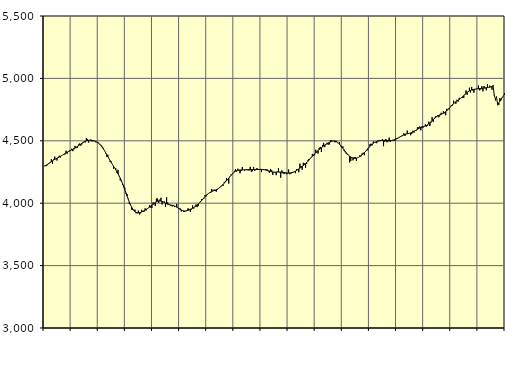
| Category | Piggar | Series 1 |
|---|---|---|
| nan | 4300.8 | 4297.25 |
| 87.0 | 4297.1 | 4302.27 |
| 87.0 | 4300.6 | 4307.8 |
| 87.0 | 4313.3 | 4314.05 |
| 87.0 | 4322.1 | 4320.34 |
| 87.0 | 4322.4 | 4326.75 |
| 87.0 | 4352.9 | 4333.14 |
| 87.0 | 4314.6 | 4339.4 |
| 87.0 | 4351.1 | 4345.41 |
| 87.0 | 4373.7 | 4350.91 |
| 87.0 | 4353.4 | 4356.05 |
| 87.0 | 4342.1 | 4360.87 |
| nan | 4368.8 | 4365.53 |
| 88.0 | 4380.7 | 4370.19 |
| 88.0 | 4366.9 | 4375.08 |
| 88.0 | 4380.6 | 4380.28 |
| 88.0 | 4385.6 | 4385.65 |
| 88.0 | 4387.2 | 4391.14 |
| 88.0 | 4390.4 | 4396.7 |
| 88.0 | 4421.1 | 4402.19 |
| 88.0 | 4396.6 | 4407.5 |
| 88.0 | 4416.2 | 4412.53 |
| 88.0 | 4421.5 | 4417.41 |
| 88.0 | 4418.7 | 4422.3 |
| nan | 4436.6 | 4427.24 |
| 89.0 | 4416.9 | 4432.22 |
| 89.0 | 4431.6 | 4437.27 |
| 89.0 | 4459.4 | 4442.49 |
| 89.0 | 4441.5 | 4448.03 |
| 89.0 | 4443.5 | 4453.99 |
| 89.0 | 4469.9 | 4460.3 |
| 89.0 | 4478 | 4466.82 |
| 89.0 | 4460.4 | 4473.35 |
| 89.0 | 4471.1 | 4479.75 |
| 89.0 | 4489.3 | 4485.74 |
| 89.0 | 4492.8 | 4491.15 |
| nan | 4486.7 | 4495.78 |
| 90.0 | 4520.4 | 4499.45 |
| 90.0 | 4512.7 | 4502.15 |
| 90.0 | 4485.9 | 4503.76 |
| 90.0 | 4504 | 4504.3 |
| 90.0 | 4510.4 | 4503.93 |
| 90.0 | 4494.1 | 4502.73 |
| 90.0 | 4503.8 | 4500.8 |
| 90.0 | 4500 | 4498.34 |
| 90.0 | 4488.6 | 4495.27 |
| 90.0 | 4489.1 | 4491.31 |
| 90.0 | 4489.9 | 4486.16 |
| nan | 4483.9 | 4479.54 |
| 91.0 | 4467.4 | 4471.19 |
| 91.0 | 4466.7 | 4461.06 |
| 91.0 | 4453.4 | 4449.3 |
| 91.0 | 4443.2 | 4436.01 |
| 91.0 | 4422.9 | 4421.37 |
| 91.0 | 4399.8 | 4405.61 |
| 91.0 | 4372 | 4389.22 |
| 91.0 | 4388.2 | 4372.75 |
| 91.0 | 4355.3 | 4356.65 |
| 91.0 | 4331.2 | 4341.21 |
| 91.0 | 4334.3 | 4326.37 |
| nan | 4311.2 | 4311.9 |
| 92.0 | 4277.2 | 4297.64 |
| 92.0 | 4283.8 | 4283.23 |
| 92.0 | 4279.1 | 4268.33 |
| 92.0 | 4242.7 | 4252.77 |
| 92.0 | 4267.4 | 4236.26 |
| 92.0 | 4216.8 | 4218.68 |
| 92.0 | 4181.9 | 4199.83 |
| 92.0 | 4182.8 | 4179.46 |
| 92.0 | 4145.9 | 4157.32 |
| 92.0 | 4144.5 | 4133.66 |
| 92.0 | 4125.7 | 4108.84 |
| nan | 4075.8 | 4083.28 |
| 93.0 | 4073.5 | 4057.77 |
| 93.0 | 4036.7 | 4033.08 |
| 93.0 | 3992.5 | 4009.7 |
| 93.0 | 3993.3 | 3988.27 |
| 93.0 | 3949.2 | 3969.46 |
| 93.0 | 3945.2 | 3953.64 |
| 93.0 | 3939 | 3941.31 |
| 93.0 | 3948.5 | 3932.5 |
| 93.0 | 3919.5 | 3926.88 |
| 93.0 | 3918.8 | 3923.94 |
| 93.0 | 3940.3 | 3923.19 |
| nan | 3910 | 3924.29 |
| 94.0 | 3918.1 | 3926.77 |
| 94.0 | 3946.7 | 3930.23 |
| 94.0 | 3933.3 | 3934.61 |
| 94.0 | 3931.4 | 3939.59 |
| 94.0 | 3959.1 | 3944.83 |
| 94.0 | 3942.3 | 3950.41 |
| 94.0 | 3955.1 | 3956.24 |
| 94.0 | 3964.8 | 3962.23 |
| 94.0 | 3985.5 | 3968.63 |
| 94.0 | 3964.9 | 3975.6 |
| 94.0 | 3963.5 | 3983 |
| nan | 4005.3 | 3990.74 |
| 95.0 | 3992.2 | 3998.51 |
| 95.0 | 3977.4 | 4005.62 |
| 95.0 | 4036.5 | 4011.48 |
| 95.0 | 4037.4 | 4015.74 |
| 95.0 | 4002.2 | 4018.14 |
| 95.0 | 4028.7 | 4018.6 |
| 95.0 | 4043.5 | 4017.23 |
| 95.0 | 3990.4 | 4014.29 |
| 95.0 | 4011 | 4010.18 |
| 95.0 | 4013.8 | 4005.33 |
| 95.0 | 3970.9 | 4000.38 |
| nan | 4047.2 | 3995.82 |
| 96.0 | 4006.3 | 3991.89 |
| 96.0 | 3990.4 | 3988.86 |
| 96.0 | 3987.3 | 3986.54 |
| 96.0 | 3979.1 | 3984.52 |
| 96.0 | 3974.3 | 3982.53 |
| 96.0 | 3985.6 | 3980.21 |
| 96.0 | 3969 | 3977.11 |
| 96.0 | 3973.2 | 3973.03 |
| 96.0 | 3994.9 | 3968.09 |
| 96.0 | 3963.3 | 3962.54 |
| 96.0 | 3953.2 | 3956.82 |
| nan | 3958.4 | 3951.25 |
| 97.0 | 3933.9 | 3946.12 |
| 97.0 | 3939.4 | 3941.87 |
| 97.0 | 3929.7 | 3938.89 |
| 97.0 | 3930.2 | 3937.51 |
| 97.0 | 3936.7 | 3937.9 |
| 97.0 | 3941.8 | 3939.87 |
| 97.0 | 3959.7 | 3942.97 |
| 97.0 | 3953.6 | 3946.76 |
| 97.0 | 3930.8 | 3950.86 |
| 97.0 | 3949.8 | 3955.15 |
| 97.0 | 3982.3 | 3959.69 |
| nan | 3956.7 | 3964.65 |
| 98.0 | 3972 | 3970.25 |
| 98.0 | 3989.3 | 3976.73 |
| 98.0 | 3968.5 | 3984.18 |
| 98.0 | 3976.5 | 3992.64 |
| 98.0 | 4002.2 | 4001.89 |
| 98.0 | 4017.5 | 4011.69 |
| 98.0 | 4033.1 | 4021.78 |
| 98.0 | 4033.6 | 4032.01 |
| 98.0 | 4037 | 4042.33 |
| 98.0 | 4064.4 | 4052.48 |
| 98.0 | 4054.8 | 4061.99 |
| nan | 4067.3 | 4070.52 |
| 99.0 | 4080.3 | 4077.96 |
| 99.0 | 4084.8 | 4084.2 |
| 99.0 | 4081.8 | 4089.43 |
| 99.0 | 4113.6 | 4093.87 |
| 99.0 | 4100.1 | 4097.66 |
| 99.0 | 4109.2 | 4100.92 |
| 99.0 | 4098.3 | 4104.11 |
| 99.0 | 4092.4 | 4107.94 |
| 99.0 | 4109.2 | 4112.79 |
| 99.0 | 4117.4 | 4118.7 |
| 99.0 | 4122.7 | 4125.63 |
| nan | 4137.3 | 4133.51 |
| 0.0 | 4145.4 | 4142.1 |
| 0.0 | 4139.2 | 4151.14 |
| 0.0 | 4167.8 | 4160.56 |
| 0.0 | 4178.7 | 4170.23 |
| 0.0 | 4202.1 | 4180.11 |
| 0.0 | 4185.6 | 4190.44 |
| 0.0 | 4157.3 | 4201.21 |
| 0.0 | 4214.8 | 4212.13 |
| 0.0 | 4229.2 | 4222.83 |
| 0.0 | 4235 | 4232.91 |
| 0.0 | 4243.4 | 4242 |
| nan | 4259.8 | 4249.75 |
| 1.0 | 4273.2 | 4255.97 |
| 1.0 | 4253.6 | 4260.63 |
| 1.0 | 4276.1 | 4263.67 |
| 1.0 | 4261.1 | 4265.32 |
| 1.0 | 4239.9 | 4266.04 |
| 1.0 | 4258.1 | 4266.23 |
| 1.0 | 4289 | 4266.44 |
| 1.0 | 4266.6 | 4266.86 |
| 1.0 | 4260.5 | 4267.3 |
| 1.0 | 4269.2 | 4267.76 |
| 1.0 | 4273.4 | 4268.23 |
| nan | 4263.8 | 4268.6 |
| 2.0 | 4262.6 | 4268.92 |
| 2.0 | 4291.2 | 4269.18 |
| 2.0 | 4252.1 | 4269.44 |
| 2.0 | 4256.7 | 4269.67 |
| 2.0 | 4288.9 | 4269.94 |
| 2.0 | 4258.5 | 4270.19 |
| 2.0 | 4273.7 | 4270.29 |
| 2.0 | 4281.6 | 4270.3 |
| 2.0 | 4266.7 | 4270.25 |
| 2.0 | 4268.7 | 4270.03 |
| 2.0 | 4275.4 | 4269.74 |
| nan | 4249.4 | 4269.35 |
| 3.0 | 4273.3 | 4268.84 |
| 3.0 | 4271.5 | 4268.16 |
| 3.0 | 4266.8 | 4267.16 |
| 3.0 | 4273.6 | 4265.65 |
| 3.0 | 4270.5 | 4263.5 |
| 3.0 | 4254.7 | 4260.78 |
| 3.0 | 4243.9 | 4257.73 |
| 3.0 | 4274.2 | 4254.65 |
| 3.0 | 4264.2 | 4251.97 |
| 3.0 | 4227 | 4250.01 |
| 3.0 | 4249.5 | 4248.9 |
| nan | 4245.7 | 4248.63 |
| 4.0 | 4224.8 | 4248.87 |
| 4.0 | 4252.6 | 4249.28 |
| 4.0 | 4279.5 | 4249.66 |
| 4.0 | 4247.8 | 4249.77 |
| 4.0 | 4204.4 | 4249.42 |
| 4.0 | 4263.2 | 4248.62 |
| 4.0 | 4238.8 | 4247.49 |
| 4.0 | 4233.4 | 4246.02 |
| 4.0 | 4247.6 | 4244.3 |
| 4.0 | 4232 | 4242.84 |
| 4.0 | 4238.9 | 4241.83 |
| nan | 4269.8 | 4241.34 |
| 5.0 | 4232.4 | 4241.72 |
| 5.0 | 4236.9 | 4242.96 |
| 5.0 | 4248.1 | 4244.92 |
| 5.0 | 4249.8 | 4247.8 |
| 5.0 | 4255.4 | 4251.78 |
| 5.0 | 4240.4 | 4256.66 |
| 5.0 | 4272.6 | 4262.21 |
| 5.0 | 4271.7 | 4268.31 |
| 5.0 | 4248.3 | 4274.78 |
| 5.0 | 4317.1 | 4281.34 |
| 5.0 | 4298.3 | 4287.98 |
| nan | 4268.6 | 4294.75 |
| 6.0 | 4324 | 4301.66 |
| 6.0 | 4317.8 | 4309.03 |
| 6.0 | 4283.9 | 4317.1 |
| 6.0 | 4315.2 | 4325.9 |
| 6.0 | 4342.6 | 4335.33 |
| 6.0 | 4355 | 4345.47 |
| 6.0 | 4355.7 | 4356.02 |
| 6.0 | 4362.7 | 4366.48 |
| 6.0 | 4394.9 | 4376.72 |
| 6.0 | 4378.3 | 4386.56 |
| 6.0 | 4384.2 | 4395.73 |
| nan | 4428.6 | 4404.48 |
| 7.0 | 4406.1 | 4412.98 |
| 7.0 | 4397.2 | 4421.14 |
| 7.0 | 4442.5 | 4429.09 |
| 7.0 | 4451.3 | 4436.9 |
| 7.0 | 4410.4 | 4444.41 |
| 7.0 | 4466.9 | 4451.56 |
| 7.0 | 4483.2 | 4458.36 |
| 7.0 | 4449.2 | 4464.86 |
| 7.0 | 4469.2 | 4471.07 |
| 7.0 | 4484.3 | 4476.87 |
| 7.0 | 4469 | 4482.33 |
| nan | 4470.9 | 4487.35 |
| 8.0 | 4503 | 4491.65 |
| 8.0 | 4503.7 | 4495.16 |
| 8.0 | 4498.7 | 4497.59 |
| 8.0 | 4498.2 | 4498.56 |
| 8.0 | 4487.6 | 4497.78 |
| 8.0 | 4499.6 | 4495.01 |
| 8.0 | 4488 | 4489.95 |
| 8.0 | 4480.8 | 4482.72 |
| 8.0 | 4490 | 4473.67 |
| 8.0 | 4456.1 | 4463.21 |
| 8.0 | 4445.5 | 4451.75 |
| nan | 4455.9 | 4439.75 |
| 9.0 | 4421.8 | 4427.64 |
| 9.0 | 4408.5 | 4415.76 |
| 9.0 | 4394.4 | 4404.48 |
| 9.0 | 4390.6 | 4394.07 |
| 9.0 | 4387.2 | 4384.77 |
| 9.0 | 4327 | 4376.72 |
| 9.0 | 4337.7 | 4370.02 |
| 9.0 | 4368.8 | 4364.94 |
| 9.0 | 4343.5 | 4361.52 |
| 9.0 | 4368.8 | 4359.78 |
| 9.0 | 4370.1 | 4359.78 |
| nan | 4339.3 | 4361.36 |
| 10.0 | 4363.9 | 4364.27 |
| 10.0 | 4368.2 | 4368.41 |
| 10.0 | 4384 | 4373.72 |
| 10.0 | 4375.8 | 4380.04 |
| 10.0 | 4398.2 | 4387.27 |
| 10.0 | 4404.6 | 4395.43 |
| 10.0 | 4384.1 | 4404.52 |
| 10.0 | 4414.9 | 4414.35 |
| 10.0 | 4422.8 | 4424.73 |
| 10.0 | 4424.1 | 4435.36 |
| 10.0 | 4442 | 4445.83 |
| nan | 4472.9 | 4455.83 |
| 11.0 | 4476.5 | 4465.11 |
| 11.0 | 4463.8 | 4473.35 |
| 11.0 | 4495 | 4480.35 |
| 11.0 | 4485.3 | 4486.12 |
| 11.0 | 4487.2 | 4490.78 |
| 11.0 | 4481.1 | 4494.33 |
| 11.0 | 4499.7 | 4497.08 |
| 11.0 | 4502.2 | 4499.28 |
| 11.0 | 4498 | 4500.97 |
| 11.0 | 4503.5 | 4502.28 |
| 11.0 | 4512.6 | 4503.23 |
| nan | 4457 | 4503.67 |
| 12.0 | 4491.9 | 4503.6 |
| 12.0 | 4514.2 | 4503.15 |
| 12.0 | 4488.2 | 4502.51 |
| 12.0 | 4495.1 | 4501.86 |
| 12.0 | 4525.2 | 4501.54 |
| 12.0 | 4490.5 | 4501.82 |
| 12.0 | 4501.7 | 4502.77 |
| 12.0 | 4506.7 | 4504.47 |
| 12.0 | 4502.9 | 4506.98 |
| 12.0 | 4500.3 | 4510.13 |
| 12.0 | 4522.4 | 4513.82 |
| nan | 4515.1 | 4518.04 |
| 13.0 | 4524 | 4522.86 |
| 13.0 | 4530.6 | 4528.19 |
| 13.0 | 4535 | 4533.67 |
| 13.0 | 4535 | 4539.04 |
| 13.0 | 4539.5 | 4543.93 |
| 13.0 | 4560.5 | 4548.12 |
| 13.0 | 4538.6 | 4551.56 |
| 13.0 | 4553.9 | 4554.24 |
| 13.0 | 4582 | 4556.33 |
| 13.0 | 4560.7 | 4558.33 |
| 13.0 | 4560 | 4560.55 |
| nan | 4544.8 | 4563.27 |
| 14.0 | 4555.2 | 4566.73 |
| 14.0 | 4580.8 | 4570.9 |
| 14.0 | 4564.7 | 4575.77 |
| 14.0 | 4582.3 | 4581.21 |
| 14.0 | 4582.2 | 4586.85 |
| 14.0 | 4607.2 | 4592.45 |
| 14.0 | 4607.6 | 4597.69 |
| 14.0 | 4614.3 | 4602.22 |
| 14.0 | 4584.2 | 4605.92 |
| 14.0 | 4616.3 | 4608.93 |
| 14.0 | 4606.4 | 4611.69 |
| nan | 4612.1 | 4614.67 |
| 15.0 | 4632 | 4618.31 |
| 15.0 | 4613.8 | 4622.97 |
| 15.0 | 4619.3 | 4628.84 |
| 15.0 | 4652.7 | 4635.89 |
| 15.0 | 4618.1 | 4643.86 |
| 15.0 | 4645.5 | 4652.33 |
| 15.0 | 4689.4 | 4660.96 |
| 15.0 | 4651.3 | 4669.64 |
| 15.0 | 4684.7 | 4678.03 |
| 15.0 | 4695.6 | 4685.86 |
| 15.0 | 4696.9 | 4692.84 |
| nan | 4704.5 | 4698.91 |
| 16.0 | 4688.3 | 4704.07 |
| 16.0 | 4704.4 | 4708.56 |
| 16.0 | 4724.6 | 4712.7 |
| 16.0 | 4714.5 | 4716.87 |
| 16.0 | 4737.8 | 4721.58 |
| 16.0 | 4720.7 | 4727.24 |
| 16.0 | 4704.6 | 4733.94 |
| 16.0 | 4756.6 | 4741.61 |
| 16.0 | 4748.2 | 4750.24 |
| 16.0 | 4751.3 | 4759.47 |
| 16.0 | 4768.2 | 4769.09 |
| nan | 4785.2 | 4778.89 |
| 17.0 | 4783.4 | 4788.55 |
| 17.0 | 4821.6 | 4797.61 |
| 17.0 | 4807 | 4805.83 |
| 17.0 | 4796.7 | 4813.13 |
| 17.0 | 4828.9 | 4819.61 |
| 17.0 | 4813.1 | 4825.71 |
| 17.0 | 4844.6 | 4831.82 |
| 17.0 | 4838.1 | 4838.33 |
| 17.0 | 4848.1 | 4845.49 |
| 17.0 | 4844.1 | 4853.45 |
| 17.0 | 4844.4 | 4862.01 |
| nan | 4867 | 4870.72 |
| 18.0 | 4904.2 | 4879.02 |
| 18.0 | 4869 | 4886.61 |
| 18.0 | 4897.4 | 4893.3 |
| 18.0 | 4925.1 | 4898.98 |
| 18.0 | 4887.3 | 4903.72 |
| 18.0 | 4930.7 | 4907.38 |
| 18.0 | 4903.4 | 4910.1 |
| 18.0 | 4885.5 | 4912.12 |
| 18.0 | 4913.8 | 4913.6 |
| 18.0 | 4914.1 | 4914.78 |
| 18.0 | 4919.8 | 4915.84 |
| nan | 4943.7 | 4916.91 |
| 19.0 | 4904.3 | 4918.11 |
| 19.0 | 4910.6 | 4919.4 |
| 19.0 | 4937.1 | 4920.75 |
| 19.0 | 4896.4 | 4922.01 |
| 19.0 | 4939.2 | 4923.08 |
| 19.0 | 4920.1 | 4924.1 |
| 19.0 | 4904.4 | 4925.16 |
| 19.0 | 4953.5 | 4926.38 |
| 19.0 | 4929.2 | 4927.86 |
| 19.0 | 4942.4 | 4929.66 |
| 19.0 | 4930.1 | 4932.01 |
| nan | 4909.3 | 4935.2 |
| 20.0 | 4946.2 | 4939.65 |
| 20.0 | 4869.2 | 4863.49 |
| 20.0 | 4823.2 | 4838.02 |
| 20.0 | 4855.2 | 4848.08 |
| 20.0 | 4784.7 | 4790.88 |
| 20.0 | 4786.8 | 4804.01 |
| 20.0 | 4841.4 | 4817.93 |
| 20.0 | 4824.6 | 4831.98 |
| 20.0 | 4848.4 | 4845.5 |
| 20.0 | 4858.9 | 4858.19 |
| 20.0 | 4882.9 | 4869.84 |